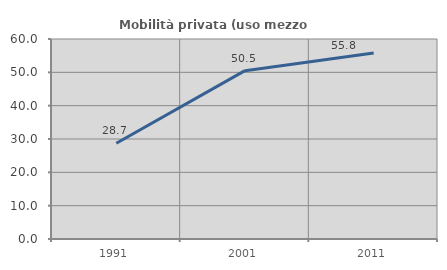
| Category | Mobilità privata (uso mezzo privato) |
|---|---|
| 1991.0 | 28.706 |
| 2001.0 | 50.505 |
| 2011.0 | 55.814 |